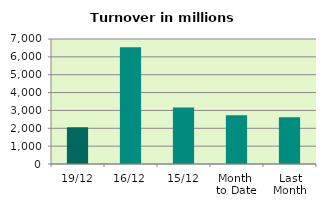
| Category | Series 0 |
|---|---|
| 19/12 | 2057.242 |
| 16/12 | 6532.925 |
| 15/12 | 3161.11 |
| Month 
to Date | 2726.969 |
| Last
Month | 2611.78 |